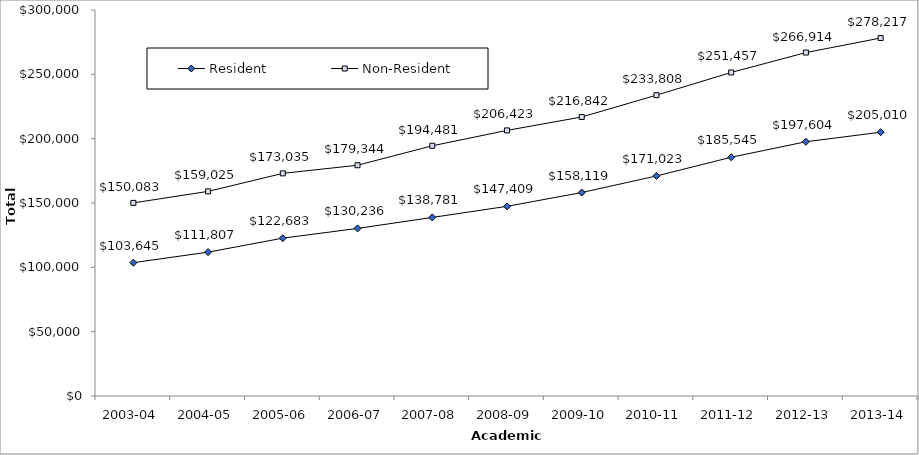
| Category | Resident | Non-Resident |
|---|---|---|
| 2003-04 | 103645 | 150083 |
| 2004-05 | 111807 | 159025 |
| 2005-06 | 122683 | 173035 |
| 2006-07 | 130236 | 179344 |
| 2007-08 | 138781 | 194481 |
| 2008-09 | 147409 | 206423 |
| 2009-10 | 158119 | 216842 |
| 2010-11 | 171023 | 233808 |
| 2011-12 | 185545 | 251457 |
| 2012-13 | 197604 | 266914 |
| 2013-14 | 205010 | 278217 |